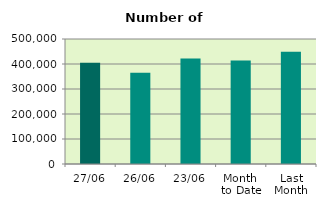
| Category | Series 0 |
|---|---|
| 27/06 | 405024 |
| 26/06 | 364604 |
| 23/06 | 422050 |
| Month 
to Date | 414186.632 |
| Last
Month | 449234.545 |